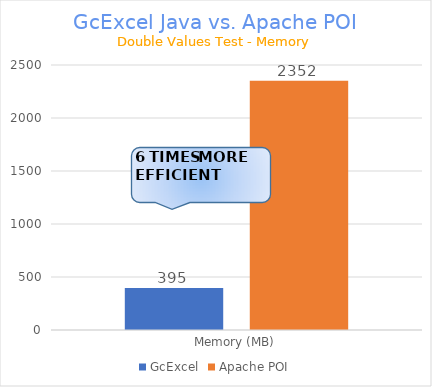
| Category | GcExcel | Apache POI |
|---|---|---|
| Memory (MB) | 395.224 | 2352.321 |